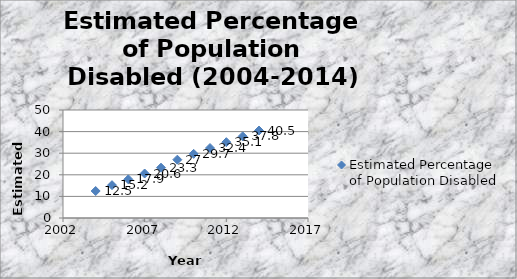
| Category | Estimated Percentage of Population Disabled |
|---|---|
| 2004.0 | 12.5 |
| 2005.0 | 15.2 |
| 2006.0 | 17.9 |
| 2007.0 | 20.6 |
| 2008.0 | 23.3 |
| 2009.0 | 27 |
| 2010.0 | 29.7 |
| 2011.0 | 32.4 |
| 2012.0 | 35.1 |
| 2013.0 | 37.8 |
| 2014.0 | 40.5 |